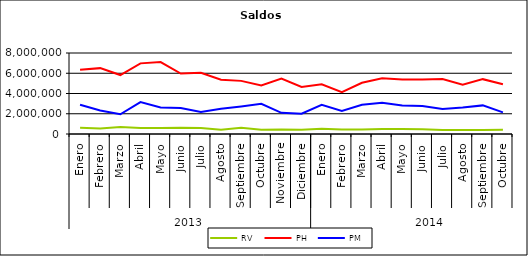
| Category | RV | PH | PM |
|---|---|---|---|
| 0 | 625726.624 | 6338490.057 | 2894951.851 |
| 1 | 552164.14 | 6505711.807 | 2320902.81 |
| 2 | 684317.675 | 5822855.149 | 1948127.804 |
| 3 | 601474.166 | 6976391.987 | 3151453.143 |
| 4 | 590050.657 | 7107878.906 | 2620515.735 |
| 5 | 624993.58 | 5975534.656 | 2574055.31 |
| 6 | 600696.535 | 6050025.472 | 2173848.831 |
| 7 | 419012.816 | 5367684.924 | 2503871.717 |
| 8 | 611730.758 | 5247250.768 | 2727549.288 |
| 9 | 419155.215 | 4784420.625 | 2990459.774 |
| 10 | 447319.577 | 5481772.72 | 2092491.866 |
| 11 | 408611.698 | 4646492.747 | 1999878.157 |
| 12 | 527889.485 | 4912075.273 | 2877652.76 |
| 13 | 454567.098 | 4120538.063 | 2278357.683 |
| 14 | 451499.2 | 5057360.029 | 2895505.472 |
| 15 | 496328.639 | 5498657.25 | 3083378.882 |
| 16 | 484463.452 | 5384146.137 | 2812191.042 |
| 17 | 465266.869 | 5373295.415 | 2775261.669 |
| 18 | 390003.439 | 5435984.925 | 2470327.976 |
| 19 | 403145.138 | 4872387.208 | 2622344.549 |
| 20 | 394930.475 | 5416500.478 | 2826484.554 |
| 21 | 412609.452 | 4912801.025 | 2138213.269 |